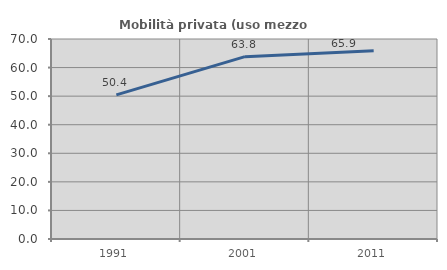
| Category | Mobilità privata (uso mezzo privato) |
|---|---|
| 1991.0 | 50.438 |
| 2001.0 | 63.816 |
| 2011.0 | 65.872 |